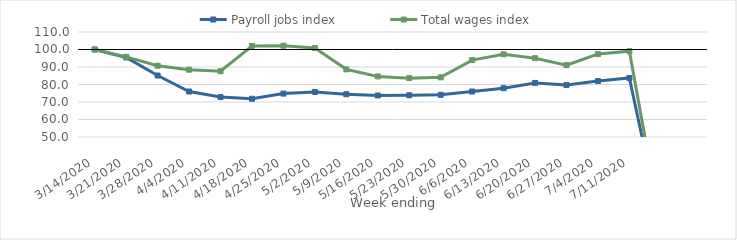
| Category | Payroll jobs index | Total wages index |
|---|---|---|
| 14/03/2020 | 100 | 100 |
| 21/03/2020 | 95.446 | 95.805 |
| 28/03/2020 | 85.131 | 90.739 |
| 04/04/2020 | 76.009 | 88.48 |
| 11/04/2020 | 72.815 | 87.567 |
| 18/04/2020 | 71.849 | 102.021 |
| 25/04/2020 | 74.821 | 102.166 |
| 02/05/2020 | 75.758 | 100.813 |
| 09/05/2020 | 74.455 | 88.655 |
| 16/05/2020 | 73.715 | 84.628 |
| 23/05/2020 | 73.85 | 83.637 |
| 30/05/2020 | 74.11 | 84.09 |
| 06/06/2020 | 75.982 | 93.957 |
| 13/06/2020 | 77.887 | 97.252 |
| 20/06/2020 | 80.897 | 95.013 |
| 27/06/2020 | 79.682 | 91.036 |
| 04/07/2020 | 81.946 | 97.375 |
| 11/07/2020 | 83.723 | 99.024 |